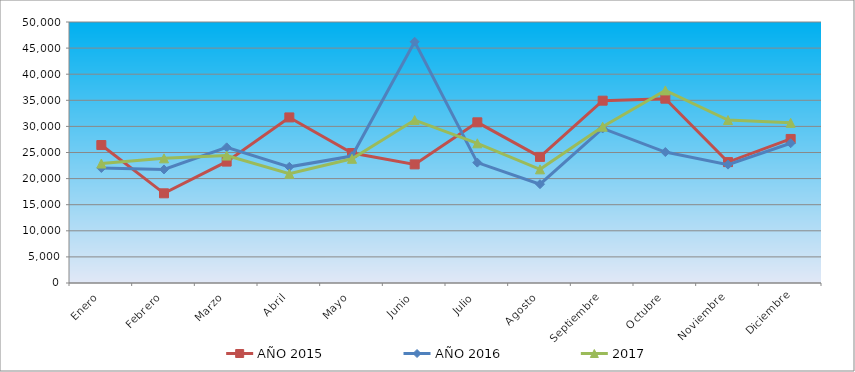
| Category | AÑO 2015 | AÑO 2016 | 2017 |
|---|---|---|---|
| Enero | 26430.398 | 22034.586 | 22888.025 |
| Febrero | 17178.686 | 21753.465 | 23881.459 |
| Marzo | 23255.434 | 25986.302 | 24414.717 |
| Abril | 31720.705 | 22253.568 | 20922.253 |
| Mayo | 24900.443 | 24324.141 | 23791.537 |
| Junio | 22724.864 | 46221.242 | 31217.659 |
| Julio | 30781.116 | 23062.093 | 26761.629 |
| Agosto | 24161.711 | 18931.034 | 21776.001 |
| Septiembre | 34928.348 | 29609.607 | 29942.865 |
| Octubre | 35311.211 | 25086.294 | 36896.979 |
| Noviembre | 23160.897 | 22674.413 | 31215.718 |
| Diciembre | 27597.266 | 26777.865 | 30682.803 |